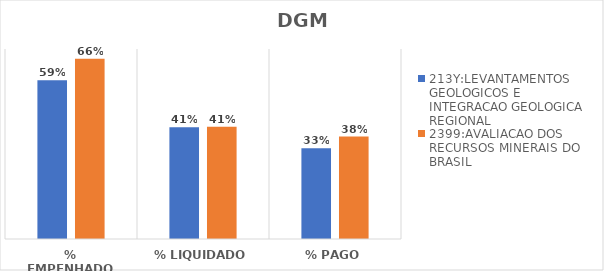
| Category | 213Y:LEVANTAMENTOS GEOLOGICOS E INTEGRACAO GEOLOGICA REGIONAL | 2399:AVALIACAO DOS RECURSOS MINERAIS DO BRASIL |
|---|---|---|
| % EMPENHADO | 0.585 | 0.664 |
| % LIQUIDADO | 0.411 | 0.414 |
| % PAGO | 0.334 | 0.377 |